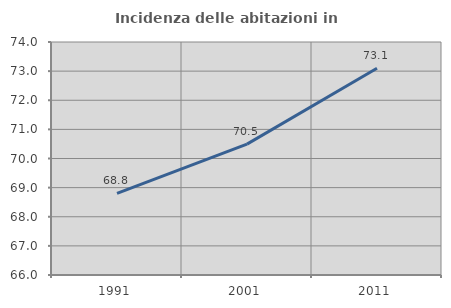
| Category | Incidenza delle abitazioni in proprietà  |
|---|---|
| 1991.0 | 68.804 |
| 2001.0 | 70.493 |
| 2011.0 | 73.1 |